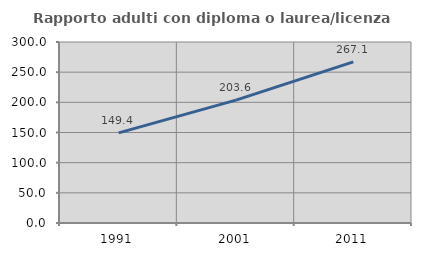
| Category | Rapporto adulti con diploma o laurea/licenza media  |
|---|---|
| 1991.0 | 149.43 |
| 2001.0 | 203.604 |
| 2011.0 | 267.079 |